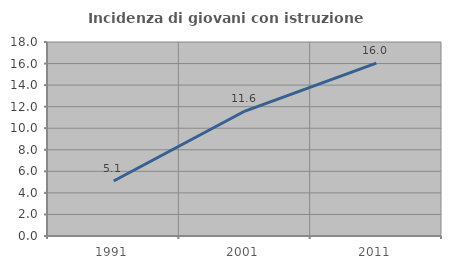
| Category | Incidenza di giovani con istruzione universitaria |
|---|---|
| 1991.0 | 5.102 |
| 2001.0 | 11.594 |
| 2011.0 | 16.038 |